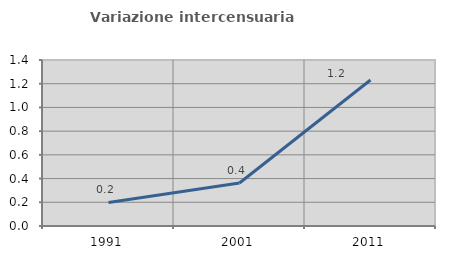
| Category | Variazione intercensuaria annua |
|---|---|
| 1991.0 | 0.198 |
| 2001.0 | 0.363 |
| 2011.0 | 1.231 |